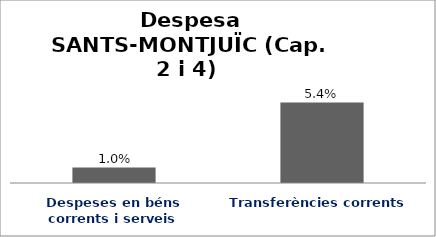
| Category | Series 0 |
|---|---|
| Despeses en béns corrents i serveis | 0.01 |
| Transferències corrents | 0.054 |